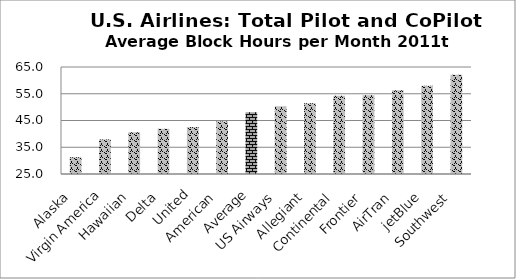
| Category | Series 0 |
|---|---|
| Alaska | 31.257 |
| Virgin America | 37.917 |
| Hawaiian | 40.617 |
| Delta | 41.895 |
| United | 42.53 |
| American | 44.655 |
| Average | 48.1 |
| US Airways | 50.355 |
| Allegiant | 51.452 |
| Continental | 54.265 |
| Frontier | 54.471 |
| AirTran | 56.303 |
| jetBlue | 57.971 |
| Southwest | 62.064 |